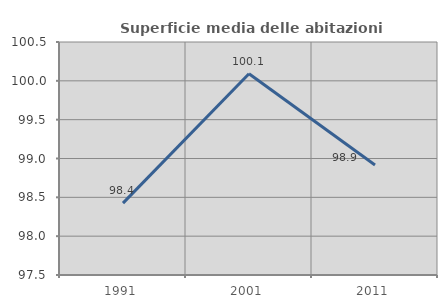
| Category | Superficie media delle abitazioni occupate |
|---|---|
| 1991.0 | 98.426 |
| 2001.0 | 100.09 |
| 2011.0 | 98.916 |